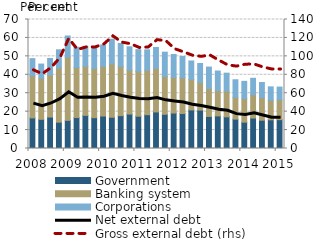
| Category | Government | Banking system | Corporations |
|---|---|---|---|
| 2008.0 | 16.608 | 22.925 | 9.223 |
| 2008.0 | 15.82 | 22.255 | 7.745 |
| 2008.0 | 17.064 | 22.789 | 9.011 |
| 2008.0 | 14.293 | 29.355 | 9.899 |
| 2009.0 | 15.261 | 34.267 | 11.534 |
| 2009.0 | 16.791 | 27.156 | 11.018 |
| 2009.0 | 17.974 | 26.589 | 10.865 |
| 2009.0 | 16.729 | 26.675 | 11.791 |
| 2010.0 | 17.609 | 26.906 | 11.672 |
| 2010.0 | 16.954 | 28.953 | 13.399 |
| 2010.0 | 17.832 | 26.637 | 12.563 |
| 2010.0 | 18.679 | 23.843 | 12.659 |
| 2011.0 | 17.503 | 24.382 | 11.75 |
| 2011.0 | 18.344 | 24.075 | 11.11 |
| 2011.0 | 19.846 | 23.641 | 11.331 |
| 2011.0 | 18.573 | 20.501 | 13.184 |
| 2012.0 | 19.241 | 19.38 | 12.418 |
| 2012.0 | 18.989 | 19.381 | 11.539 |
| 2012.0 | 20.922 | 16.517 | 10.059 |
| 2012.0 | 20.839 | 14.964 | 10.306 |
| 2013.0 | 17.396 | 15.203 | 11.582 |
| 2013.0 | 17.688 | 13.709 | 10.641 |
| 2013.0 | 17.178 | 13.979 | 9.719 |
| 2013.0 | 15.933 | 11.807 | 9.557 |
| 2014.0 | 14.28 | 12.795 | 9.353 |
| 2014.0 | 16.535 | 12.645 | 8.921 |
| 2014.0 | 15.353 | 12.265 | 8.196 |
| 2014.0 | 15.574 | 10.554 | 7.317 |
| 2015.0 | 15.667 | 10.78 | 6.882 |